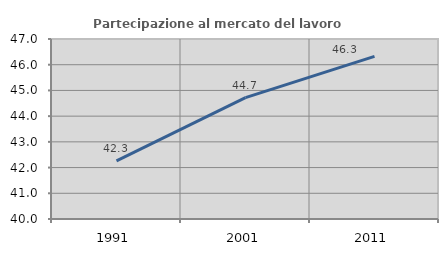
| Category | Partecipazione al mercato del lavoro  femminile |
|---|---|
| 1991.0 | 42.259 |
| 2001.0 | 44.722 |
| 2011.0 | 46.326 |